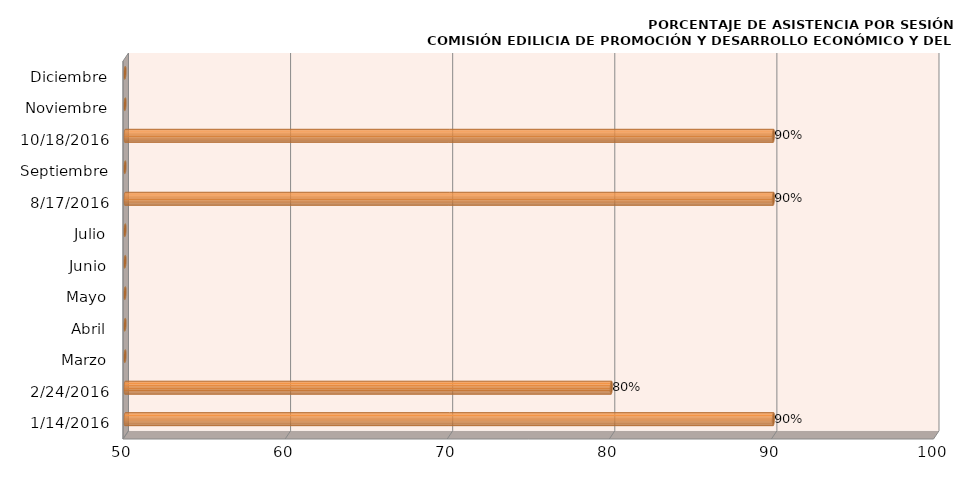
| Category | Series 0 |
|---|---|
| 14/01/2016 | 90 |
| 24/02/2016 | 80 |
| Marzo | 0 |
| Abril | 0 |
| Mayo | 0 |
| Junio | 0 |
| Julio | 0 |
| 17/08/2016 | 90 |
| Septiembre | 0 |
| 18/10/2016 | 90 |
| Noviembre | 0 |
| Diciembre | 0 |